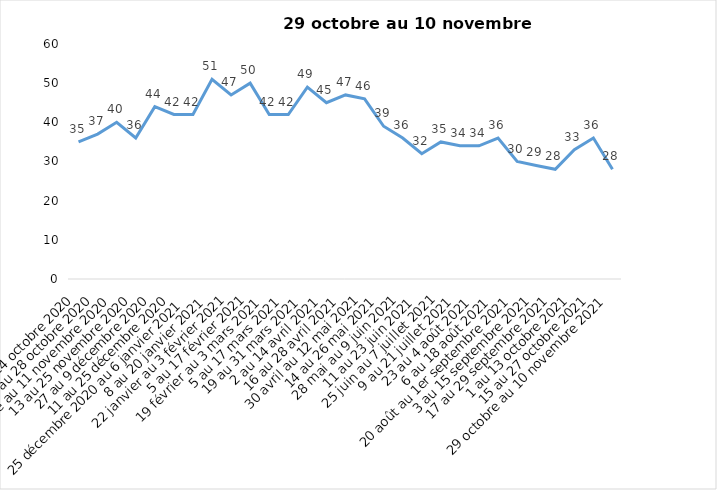
| Category | Toujours aux trois mesures |
|---|---|
| 2 au 14 octobre 2020 | 35 |
| 16 au 28 octobre 2020 | 37 |
| 30 octobre au 11 novembre 2020 | 40 |
| 13 au 25 novembre 2020 | 36 |
| 27 au 9 décembre 2020 | 44 |
| 11 au 25 décembre 2020 | 42 |
| 25 décembre 2020 au 6 janvier 2021 | 42 |
| 8 au 20 janvier 2021 | 51 |
| 22 janvier au 3 février 2021 | 47 |
| 5 au 17 février 2021 | 50 |
| 19 février au 3 mars 2021 | 42 |
| 5 au 17 mars 2021 | 42 |
| 19 au 31 mars 2021 | 49 |
| 2 au 14 avril 2021 | 45 |
| 16 au 28 avril 2021 | 47 |
| 30 avril au 12 mai 2021 | 46 |
| 14 au 26 mai 2021 | 39 |
| 28 mai au 9 juin 2021 | 36 |
| 11 au 23 juin 2021 | 32 |
| 25 juin au 7 juillet 2021 | 35 |
| 9 au 21 juillet 2021 | 34 |
| 23 au 4 août 2021 | 34 |
| 6 au 18 août 2021 | 36 |
| 20 août au 1er septembre 2021 | 30 |
| 3 au 15 septembre 2021 | 29 |
| 17 au 29 septembre 2021 | 28 |
| 1 au 13 octobre 2021 | 33 |
| 15 au 27 octobre 2021 | 36 |
| 29 octobre au 10 novembre 2021 | 28 |